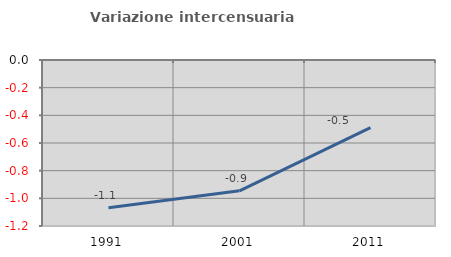
| Category | Variazione intercensuaria annua |
|---|---|
| 1991.0 | -1.068 |
| 2001.0 | -0.946 |
| 2011.0 | -0.489 |